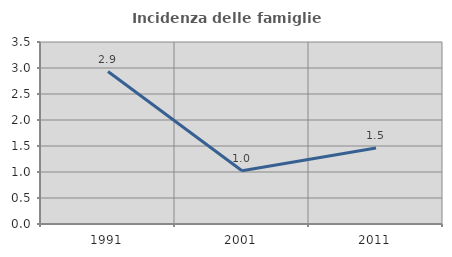
| Category | Incidenza delle famiglie numerose |
|---|---|
| 1991.0 | 2.932 |
| 2001.0 | 1.023 |
| 2011.0 | 1.46 |